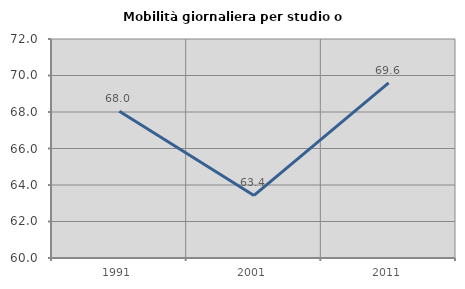
| Category | Mobilità giornaliera per studio o lavoro |
|---|---|
| 1991.0 | 68.039 |
| 2001.0 | 63.43 |
| 2011.0 | 69.593 |